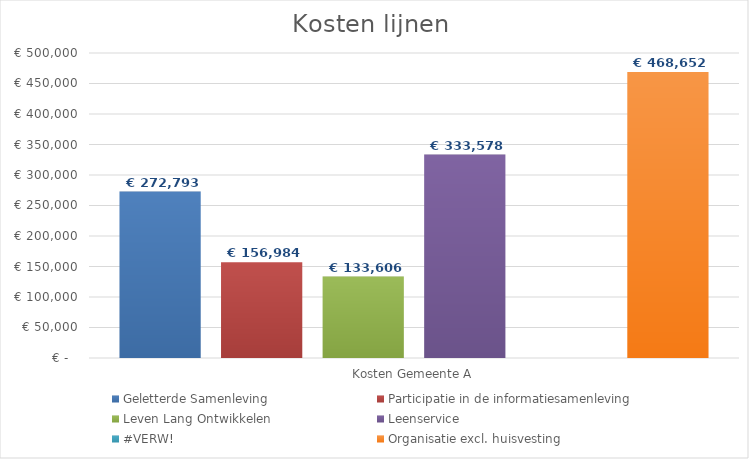
| Category | Geletterde Samenleving | Participatie in de informatiesamenleving | Leven Lang Ontwikkelen | Leenservice | #VERW! | Organisatie excl. huisvesting |
|---|---|---|---|---|---|---|
| Kosten Gemeente A | 272793.051 | 156984.406 | 133606.492 | 333578.105 | 1 | 468651.879 |